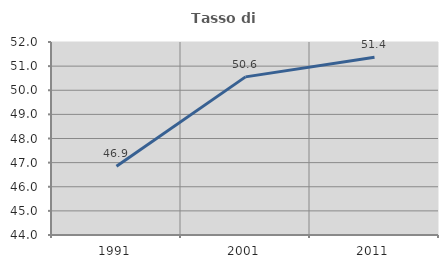
| Category | Tasso di occupazione   |
|---|---|
| 1991.0 | 46.854 |
| 2001.0 | 50.554 |
| 2011.0 | 51.372 |